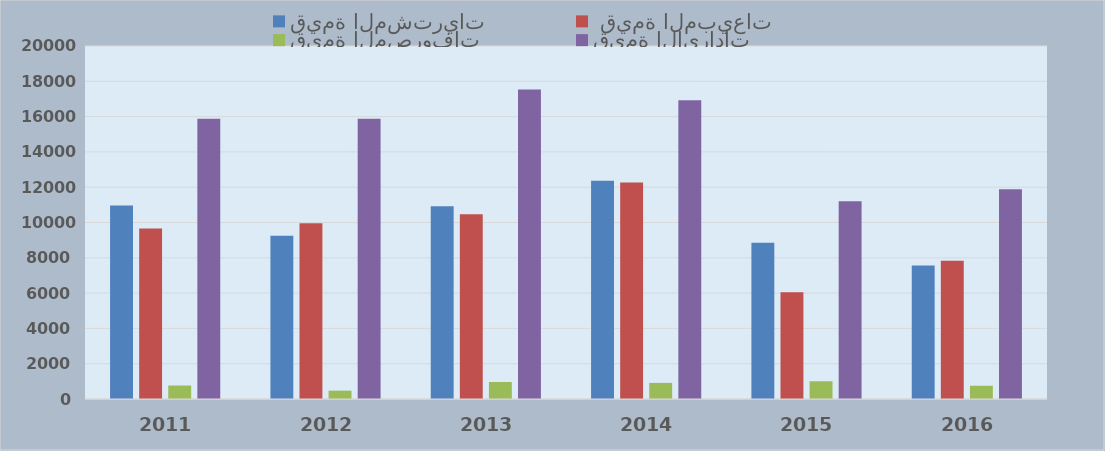
| Category | قيمة المشتريات |  قيمة المبيعات | قيمة المصروفات | قيمة الايرادات |
|---|---|---|---|---|
| 2011.0 | 10968 | 9663 | 764 | 15873 |
| 2012.0 | 9245 | 9953 | 474 | 15878 |
| 2013.0 | 10918 | 10467 | 962 | 17537 |
| 2014.0 | 12365 | 12272 | 912 | 16928 |
| 2015.0 | 8856 | 6053 | 1005 | 11204 |
| 2016.0 | 7565 | 7828 | 751 | 11883 |